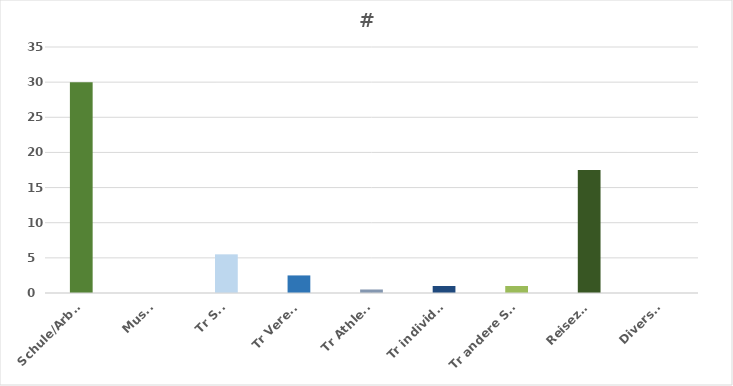
| Category | 30 |
|---|---|
| Schule/Arbeit | 30 |
| Musik | 0 |
| Tr StP | 5.5 |
| Tr Verein | 2.5 |
| Tr Athletik | 0.5 |
| Tr individuell | 1 |
| Tr andere SpA | 1 |
| Reisezeit | 17.5 |
| Diverses | 0 |